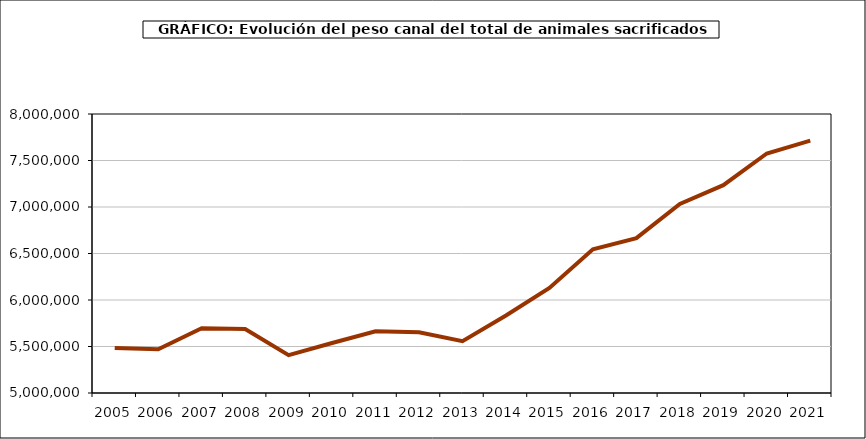
| Category | Series 0 |
|---|---|
| 2005.0 | 5484133.682 |
| 2006.0 | 5469928.516 |
| 2007.0 | 5697170.115 |
| 2008.0 | 5687912.363 |
| 2009.0 | 5406476.675 |
| 2010.0 | 5537415.454 |
| 2011.0 | 5664197.217 |
| 2012.0 | 5653769.803 |
| 2013.0 | 5556795.031 |
| 2014.0 | 5833789.68 |
| 2015.0 | 6129137.234 |
| 2016.0 | 6544369.423 |
| 2017.0 | 6665614.034 |
| 2018.0 | 7032931.593 |
| 2019.0 | 7235051.281 |
| 2020.0 | 7575219.284 |
| 2021.0 | 7713923.695 |